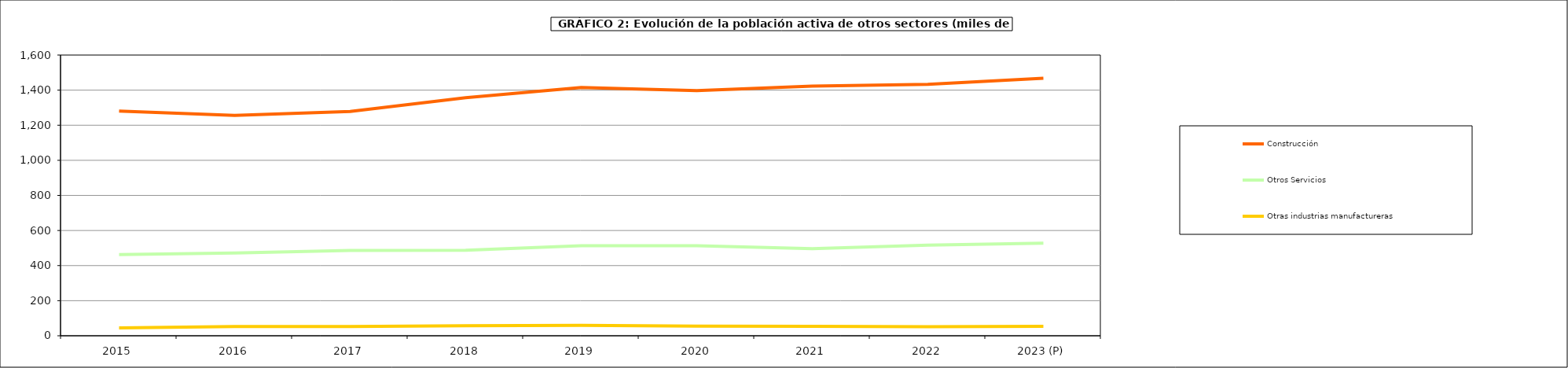
| Category | Construcción | Otros Servicios | Otras industrias manufactureras |
|---|---|---|---|
| 2015 | 1280.975 | 462.325 | 44.95 |
| 2016 | 1256.45 | 471.23 | 52.98 |
| 2017 | 1278.6 | 486.4 | 52.6 |
| 2018 | 1356.625 | 486.875 | 57 |
| 2019 | 1415.25 | 513.675 | 59.45 |
| 2020 | 1397.475 | 512.975 | 55.3 |
| 2021 | 1423.3 | 496.875 | 54.1 |
| 2022 | 1433 | 516.05 | 51.575 |
| 2023 (P) | 1468.15 | 527.6 | 53.925 |